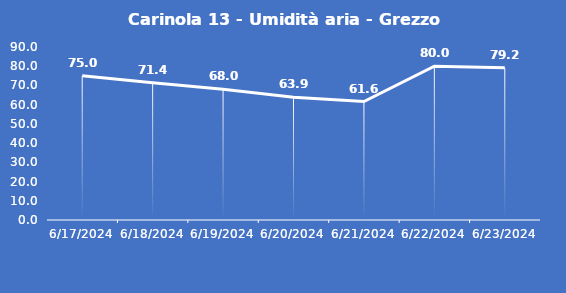
| Category | Carinola 13 - Umidità aria - Grezzo (%) |
|---|---|
| 6/17/24 | 75 |
| 6/18/24 | 71.4 |
| 6/19/24 | 68 |
| 6/20/24 | 63.9 |
| 6/21/24 | 61.6 |
| 6/22/24 | 80 |
| 6/23/24 | 79.2 |